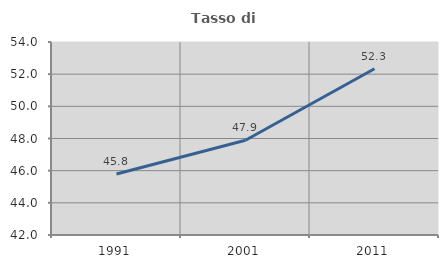
| Category | Tasso di occupazione   |
|---|---|
| 1991.0 | 45.794 |
| 2001.0 | 47.892 |
| 2011.0 | 52.334 |